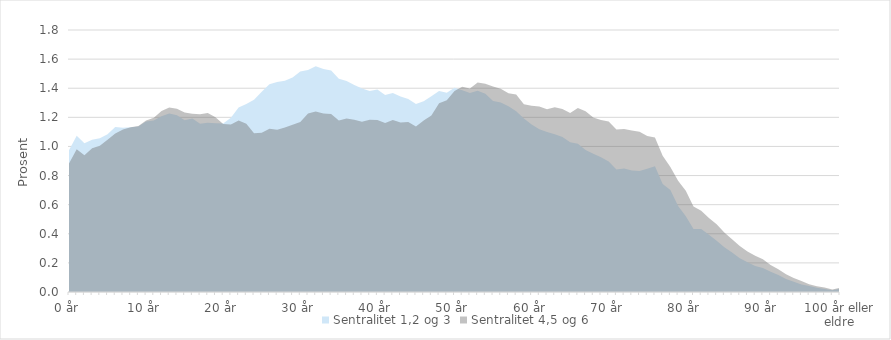
| Category | Sentralitet 1,2 og 3 | Sentralitet 4,5 og 6 |
|---|---|---|
| 0 år | 0.974 | 0.884 |
| 1 år | 1.074 | 0.98 |
| 2 år | 1.023 | 0.939 |
| 3 år | 1.046 | 0.988 |
| 4 år | 1.057 | 1.004 |
| 5 år | 1.084 | 1.046 |
| 6 år | 1.133 | 1.089 |
| 7 år | 1.128 | 1.116 |
| 8 år | 1.131 | 1.131 |
| 9 år | 1.136 | 1.14 |
| 10 år | 1.172 | 1.178 |
| 11 år | 1.179 | 1.198 |
| 12 år | 1.208 | 1.244 |
| 13 år | 1.227 | 1.268 |
| 14 år | 1.214 | 1.259 |
| 15 år | 1.18 | 1.234 |
| 16 år | 1.193 | 1.225 |
| 17 år | 1.155 | 1.222 |
| 18 år | 1.163 | 1.23 |
| 19 år | 1.16 | 1.2 |
| 20 år | 1.157 | 1.155 |
| 21 år | 1.198 | 1.151 |
| 22 år | 1.268 | 1.178 |
| 23 år | 1.291 | 1.155 |
| 24 år | 1.32 | 1.09 |
| 25 år | 1.376 | 1.094 |
| 26 år | 1.427 | 1.121 |
| 27 år | 1.442 | 1.114 |
| 28 år | 1.451 | 1.131 |
| 29 år | 1.473 | 1.149 |
| 30 år | 1.515 | 1.167 |
| 31 år | 1.525 | 1.226 |
| 32 år | 1.552 | 1.241 |
| 33 år | 1.533 | 1.227 |
| 34 år | 1.522 | 1.223 |
| 35 år | 1.466 | 1.179 |
| 36 år | 1.45 | 1.192 |
| 37 år | 1.421 | 1.183 |
| 38 år | 1.398 | 1.169 |
| 39 år | 1.382 | 1.183 |
| 40 år | 1.391 | 1.181 |
| 41 år | 1.354 | 1.162 |
| 42 år | 1.368 | 1.182 |
| 43 år | 1.343 | 1.165 |
| 44 år | 1.327 | 1.168 |
| 45 år | 1.292 | 1.137 |
| 46 år | 1.311 | 1.178 |
| 47 år | 1.344 | 1.213 |
| 48 år | 1.381 | 1.297 |
| 49 år | 1.369 | 1.317 |
| 50 år | 1.403 | 1.381 |
| 51 år | 1.387 | 1.41 |
| 52 år | 1.367 | 1.398 |
| 53 år | 1.382 | 1.439 |
| 54 år | 1.363 | 1.431 |
| 55 år | 1.313 | 1.411 |
| 56 år | 1.302 | 1.396 |
| 57 år | 1.277 | 1.365 |
| 58 år | 1.243 | 1.358 |
| 59 år | 1.193 | 1.291 |
| 60 år | 1.151 | 1.279 |
| 61 år | 1.119 | 1.274 |
| 62 år | 1.1 | 1.256 |
| 63 år | 1.083 | 1.269 |
| 64 år | 1.064 | 1.257 |
| 65 år | 1.029 | 1.229 |
| 66 år | 1.018 | 1.264 |
| 67 år | 0.976 | 1.241 |
| 68 år | 0.95 | 1.2 |
| 69 år | 0.926 | 1.181 |
| 70 år | 0.897 | 1.171 |
| 71 år | 0.842 | 1.117 |
| 72 år | 0.848 | 1.12 |
| 73 år | 0.834 | 1.109 |
| 74 år | 0.832 | 1.101 |
| 75 år | 0.846 | 1.071 |
| 76 år | 0.864 | 1.062 |
| 77 år | 0.741 | 0.935 |
| 78 år | 0.701 | 0.858 |
| 79 år | 0.591 | 0.764 |
| 80 år | 0.52 | 0.696 |
| 81 år | 0.432 | 0.587 |
| 82 år | 0.432 | 0.558 |
| 83 år | 0.393 | 0.509 |
| 84 år | 0.352 | 0.466 |
| 85 år | 0.308 | 0.409 |
| 86 år | 0.272 | 0.362 |
| 87 år | 0.232 | 0.316 |
| 88 år | 0.204 | 0.278 |
| 89 år | 0.179 | 0.248 |
| 90 år | 0.166 | 0.225 |
| 91 år | 0.139 | 0.186 |
| 92 år | 0.116 | 0.157 |
| 93 år | 0.09 | 0.122 |
| 94 år | 0.07 | 0.096 |
| 95 år | 0.051 | 0.075 |
| 96 år | 0.042 | 0.054 |
| 97 år | 0.029 | 0.04 |
| 98 år | 0.02 | 0.031 |
| 99 år | 0.012 | 0.018 |
| 100 år eller eldre | 0.021 | 0.028 |